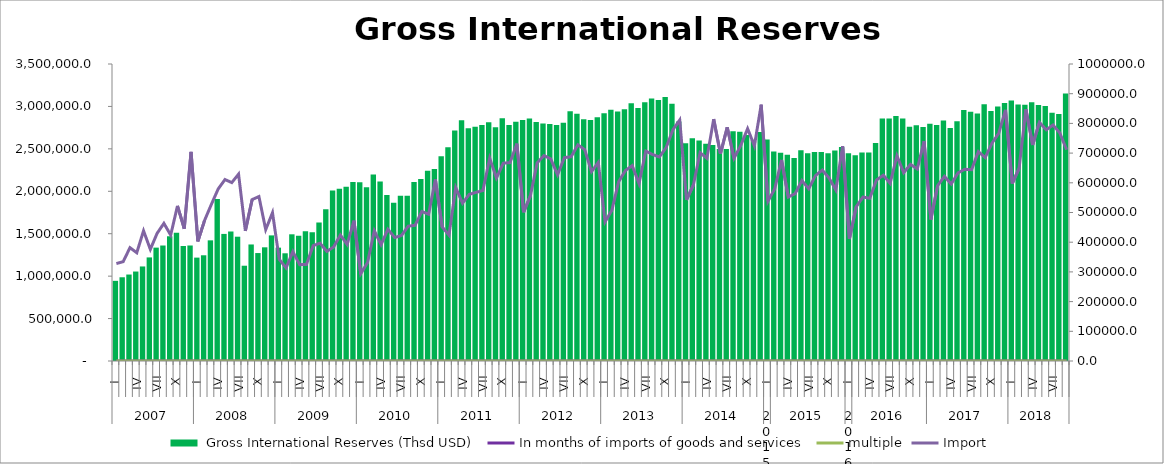
| Category |  Gross International Reserves (Thsd USD) |
|---|---|
| 0 | 944569.356 |
| 1 | 986716.087 |
| 2 | 1018970.638 |
| 3 | 1054278.365 |
| 4 | 1114160.468 |
| 5 | 1220729.487 |
| 6 | 1336062.499 |
| 7 | 1360970.198 |
| 8 | 1469799.647 |
| 9 | 1510431.083 |
| 10 | 1355160.588 |
| 11 | 1361139.94 |
| 12 | 1218380.992 |
| 13 | 1245880.818 |
| 14 | 1421919.99 |
| 15 | 1910253.845 |
| 16 | 1497582.718 |
| 17 | 1526134.644 |
| 18 | 1464749.428 |
| 19 | 1122855.834 |
| 20 | 1373330.153 |
| 21 | 1272102.001 |
| 22 | 1339757.483 |
| 23 | 1480157.563 |
| 24 | 1335830.434 |
| 25 | 1269325.862 |
| 26 | 1493108.058 |
| 27 | 1476027.716 |
| 28 | 1530375.506 |
| 29 | 1518203.703 |
| 30 | 1632579.525 |
| 31 | 1788341.435 |
| 32 | 2009955.589 |
| 33 | 2030508.619 |
| 34 | 2052635.598 |
| 35 | 2110413.479 |
| 36 | 2106203.981 |
| 37 | 2046269.085 |
| 38 | 2199234.144 |
| 39 | 2116174.036 |
| 40 | 1957092.26 |
| 41 | 1864408.87 |
| 42 | 1947257.286 |
| 43 | 1948646.735 |
| 44 | 2110240.516 |
| 45 | 2143452.411 |
| 46 | 2243098.08 |
| 47 | 2263931.003 |
| 48 | 2413276.234 |
| 49 | 2519379.834 |
| 50 | 2717701.26 |
| 51 | 2838315.136 |
| 52 | 2741576.745 |
| 53 | 2759253.793 |
| 54 | 2782237.942 |
| 55 | 2813452.719 |
| 56 | 2755211.768 |
| 57 | 2861887.778 |
| 58 | 2780195.98 |
| 59 | 2818259.268 |
| 60 | 2839594.988 |
| 61 | 2856750.893 |
| 62 | 2816704.829 |
| 63 | 2798459.455 |
| 64 | 2793387.554 |
| 65 | 2780985.069 |
| 66 | 2807413.792 |
| 67 | 2943749.499 |
| 68 | 2914658.817 |
| 69 | 2849332.726 |
| 70 | 2841471.603 |
| 71 | 2872974.007 |
| 72 | 2920913.483 |
| 73 | 2960164.648 |
| 74 | 2941281.374 |
| 75 | 2967640.231 |
| 76 | 3038439.423 |
| 77 | 2981696.572 |
| 78 | 3048940.273 |
| 79 | 3094880.401 |
| 80 | 3074514.403 |
| 81 | 3110052.596 |
| 82 | 3030762.59 |
| 83 | 2823422.31 |
| 84 | 2566485.807 |
| 85 | 2625815.897 |
| 86 | 2598611.489 |
| 87 | 2561530.614 |
| 88 | 2546888.469 |
| 89 | 2498141.455 |
| 90 | 2499536.21 |
| 91 | 2707900.374 |
| 92 | 2701161.577 |
| 93 | 2661929.063 |
| 94 | 2607504.967 |
| 95 | 2699187.561 |
| 96 | 2610108.469 |
| 97 | 2469434.991 |
| 98 | 2452879.825 |
| 99 | 2430898.174 |
| 100 | 2393461.564 |
| 101 | 2483749.819 |
| 102 | 2447135.694 |
| 103 | 2463246.038 |
| 104 | 2464305.635 |
| 105 | 2448949.349 |
| 106 | 2479433.026 |
| 107 | 2520576.458 |
| 108 | 2447473.906 |
| 109 | 2425874.122 |
| 110 | 2456678.704 |
| 111 | 2456757.547 |
| 112 | 2569385.763 |
| 113 | 2857243.993 |
| 114 | 2856372.165 |
| 115 | 2888476.122 |
| 116 | 2858235.696 |
| 117 | 2760196.146 |
| 118 | 2779157.145 |
| 119 | 2757417.107 |
| 120 | 2797144.593 |
| 121 | 2781130.045 |
| 122 | 2832873.183 |
| 123 | 2745865.823 |
| 124 | 2826021.753 |
| 125 | 2956463.581 |
| 126 | 2938356.066 |
| 127 | 2915223.788 |
| 128 | 3025040.952 |
| 129 | 2945349.028 |
| 130 | 2999154.228 |
| 131 | 3038994.561 |
| 132 | 3069440.177 |
| 133 | 3022556.548 |
| 134 | 3019418.473 |
| 135 | 3049424.102 |
| 136 | 3015678.434 |
| 137 | 3005134.527 |
| 138 | 2925530.517 |
| 139 | 2911383.682 |
| 140 | 3152589.591 |